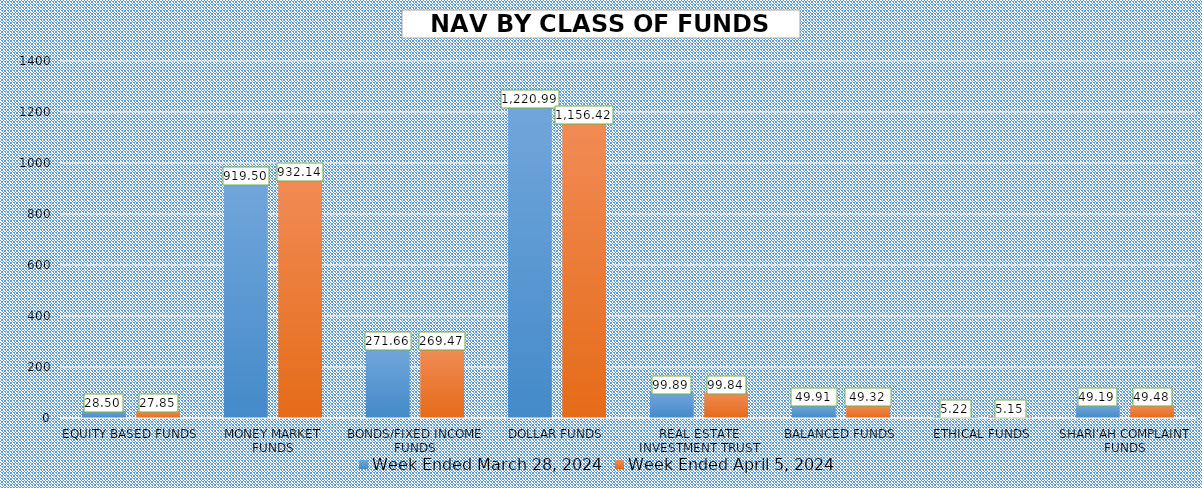
| Category | Week Ended March 28, 2024 | Week Ended April 5, 2024 |
|---|---|---|
| EQUITY BASED FUNDS | 28.5 | 27.852 |
| MONEY MARKET FUNDS | 919.496 | 932.135 |
| BONDS/FIXED INCOME FUNDS | 271.659 | 269.472 |
| DOLLAR FUNDS | 1220.986 | 1156.417 |
| REAL ESTATE INVESTMENT TRUST | 99.892 | 99.837 |
| BALANCED FUNDS | 49.905 | 49.32 |
| ETHICAL FUNDS | 5.216 | 5.149 |
| SHARI'AH COMPLAINT FUNDS | 49.193 | 49.48 |